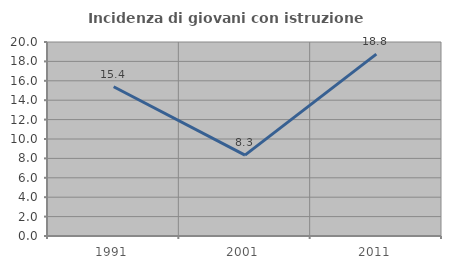
| Category | Incidenza di giovani con istruzione universitaria |
|---|---|
| 1991.0 | 15.385 |
| 2001.0 | 8.333 |
| 2011.0 | 18.75 |